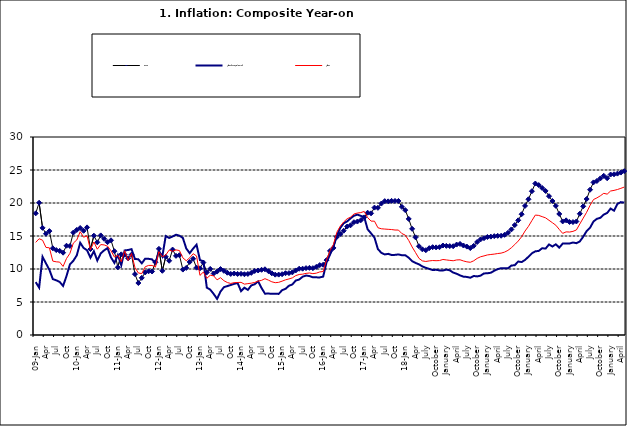
| Category | Food | All Items less Farm Produce | All Items |
|---|---|---|---|
| 09-Jan | 18.436 | 8.013 | 14.034 |
| Feb | 20.041 | 7.178 | 14.584 |
| Mar | 16.233 | 11.842 | 14.366 |
| Apr | 15.342 | 10.85 | 13.268 |
| May | 15.74 | 9.88 | 13.212 |
| June | 13.138 | 8.472 | 11.194 |
| Jul | 12.867 | 8.285 | 11.09 |
| Aug | 12.746 | 8.044 | 11.046 |
| Sep | 12.472 | 7.431 | 10.39 |
| Oct | 13.524 | 8.933 | 11.588 |
| Nov | 13.482 | 10.702 | 12.368 |
| Dec | 15.518 | 11.249 | 13.93 |
| 10-Jan | 15.918 | 12.063 | 14.398 |
| Feb | 16.208 | 13.978 | 15.649 |
| Mar | 15.79 | 13.184 | 14.812 |
| Apr | 16.306 | 12.844 | 15.044 |
| May | 13.023 | 11.711 | 12.915 |
| Jun | 15.053 | 12.686 | 14.099 |
| Jul | 14.043 | 11.287 | 13.002 |
| Aug | 15.09 | 12.366 | 13.702 |
| Sep | 14.57 | 12.83 | 13.65 |
| Oct | 14.065 | 13.168 | 13.45 |
| Nov | 14.351 | 11.746 | 12.766 |
| Dec | 12.701 | 10.917 | 11.815 |
| 11-Jan | 10.255 | 12.118 | 12.08 |
| Feb | 12.221 | 10.569 | 11.1 |
| Mar | 12.169 | 12.815 | 12.779 |
| Apr | 11.629 | 12.882 | 11.291 |
| May | 12.179 | 13.006 | 12.352 |
| Jun | 9.22 | 11.524 | 10.23 |
| Jul | 7.877 | 11.472 | 9.397 |
| Aug | 8.665 | 10.863 | 9.301 |
| Sep | 9.479 | 11.567 | 10.339 |
| Oct | 9.656 | 11.539 | 10.544 |
| Nov | 9.623 | 11.459 | 10.54 |
| Dec | 11.02 | 10.822 | 10.283 |
| 12-Jan | 13.053 | 12.748 | 12.626 |
| 12-Feb | 9.729 | 11.901 | 11.866 |
| 12-Mar | 11.848 | 14.995 | 12.111 |
| Apr | 11.246 | 14.703 | 12.866 |
| May | 12.942 | 14.926 | 12.688 |
| Jun | 11.991 | 15.199 | 12.892 |
| Jul | 12.093 | 15.045 | 12.797 |
| Aug | 9.91 | 14.714 | 11.689 |
| Sep | 10.164 | 13.101 | 11.253 |
| Oct | 11.064 | 12.398 | 11.693 |
| Nov | 11.553 | 13.092 | 12.32 |
| Dec | 10.199 | 13.685 | 11.981 |
| 13-Jan | 10.106 | 11.342 | 9.031 |
| Feb | 10.973 | 11.184 | 9.542 |
| Mar | 9.482 | 7.179 | 8.593 |
| Apr | 10.006 | 6.874 | 9.052 |
| May | 9.321 | 6.227 | 8.964 |
| Jun | 9.606 | 5.472 | 8.353 |
| Jul | 9.994 | 6.58 | 8.682 |
| Aug | 9.723 | 7.245 | 8.231 |
| Sep | 9.437 | 7.41 | 7.952 |
| Oct | 9.249 | 7.579 | 7.807 |
| Nov | 9.313 | 7.75 | 7.931 |
| Dec | 9.253 | 7.872 | 7.957 |
| 14-Jan | 9.271 | 6.648 | 7.977 |
| Feb | 9.207 | 7.166 | 7.707 |
| Mar | 9.254 | 6.836 | 7.783 |
| Apr | 9.414 | 7.508 | 7.851 |
| May | 9.698 | 7.693 | 7.965 |
| Jun | 9.776 | 8.122 | 8.167 |
| Jul | 9.878 | 7.116 | 8.281 |
| Aug | 9.959 | 6.264 | 8.534 |
| Sep | 9.676 | 6.278 | 8.317 |
| Oct | 9.343 | 6.252 | 8.06 |
| Nov | 9.144 | 6.255 | 7.927 |
| Dec | 9.152 | 6.225 | 7.978 |
| 15-Jan | 9.215 | 6.787 | 8.157 |
| Feb | 9.359 | 6.994 | 8.359 |
| Mar | 9.376 | 7.46 | 8.494 |
| Apr | 9.49 | 7.661 | 8.655 |
| May | 9.782 | 8.253 | 9.003 |
| Jun | 10.041 | 8.403 | 9.168 |
| Jul | 10.049 | 8.83 | 9.218 |
| Aug | 10.131 | 9.01 | 9.336 |
| Sep | 10.174 | 8.928 | 9.394 |
| Oct | 10.129 | 8.742 | 9.296 |
| Nov | 10.321 | 8.732 | 9.368 |
| Dec | 10.588 | 8.727 | 9.554 |
| 16-Jan | 10.642 | 8.841 | 9.617 |
| Feb | 11.348 | 11.041 | 11.379 |
| Mar | 12.745 | 12.17 | 12.775 |
| Apr | 13.194 | 13.352 | 13.721 |
| May | 14.861 | 15.054 | 15.577 |
| Jun | 15.302 | 16.224 | 16.48 |
| Jul | 15.799 | 16.929 | 17.127 |
| Aug | 16.427 | 17.208 | 17.609 |
| Sep | 16.622 | 17.666 | 17.852 |
| Oct | 17.09 | 18.067 | 18.33 |
| Nov | 17.191 | 18.241 | 18.476 |
| Dec | 17.388 | 18.052 | 18.547 |
| 17-Jan | 17.818 | 17.867 | 18.719 |
| Feb | 18.528 | 16.011 | 17.78 |
| Mar | 18.436 | 15.404 | 17.256 |
| Apr | 19.303 | 14.75 | 17.244 |
| May | 19.266 | 13.016 | 16.251 |
| Jun | 19.915 | 12.455 | 16.098 |
| Jul | 20.284 | 12.207 | 16.053 |
| Aug | 20.251 | 12.296 | 16.012 |
| Sep | 20.321 | 12.123 | 15.979 |
| Oct | 20.306 | 12.142 | 15.905 |
| Nov | 20.308 | 12.206 | 15.901 |
| Dec | 19.415 | 12.089 | 15.372 |
| 18-Jan | 18.919 | 12.09 | 15.127 |
| Feb | 17.588 | 11.707 | 14.33 |
| Mar | 16.08 | 11.181 | 13.337 |
| Apr | 14.799 | 10.92 | 12.482 |
| May | 13.448 | 10.71 | 11.608 |
| June | 12.977 | 10.387 | 11.231 |
| July | 12.85 | 10.183 | 11.142 |
| August | 13.158 | 10.015 | 11.227 |
| September | 13.309 | 9.838 | 11.284 |
| October | 13.277 | 9.882 | 11.259 |
| November | 13.301 | 9.787 | 11.281 |
| December | 13.559 | 9.771 | 11.442 |
| January | 13.505 | 9.91 | 11.374 |
| February | 13.473 | 9.8 | 11.306 |
| March | 13.451 | 9.461 | 11.251 |
| April | 13.701 | 9.28 | 11.372 |
| May | 13.794 | 9.033 | 11.396 |
| June | 13.558 | 8.841 | 11.217 |
| July | 13.392 | 8.798 | 11.084 |
| August | 13.17 | 8.678 | 11.016 |
| September | 13.507 | 8.945 | 11.244 |
| October | 14.088 | 8.876 | 11.607 |
| November | 14.482 | 8.993 | 11.854 |
| December | 14.667 | 9.331 | 11.982 |
| January | 14.849 | 9.349 | 12.132 |
| February | 14.904 | 9.434 | 12.199 |
| March | 14.977 | 9.732 | 12.257 |
| April | 15.026 | 9.979 | 12.341 |
| May | 15.036 | 10.12 | 12.404 |
| June | 15.175 | 10.128 | 12.559 |
| July | 15.482 | 10.102 | 12.821 |
| August | 15.996 | 10.521 | 13.22 |
| September | 16.66 | 10.581 | 13.707 |
| October | 17.378 | 11.137 | 14.233 |
| November | 18.298 | 11.05 | 14.887 |
| December | 19.562 | 11.374 | 15.753 |
| January | 20.567 | 11.854 | 16.466 |
| February | 21.786 | 12.382 | 17.335 |
| March | 22.948 | 12.673 | 18.171 |
| April | 22.719 | 12.743 | 18.117 |
| May | 22.277 | 13.145 | 17.933 |
| June | 21.829 | 13.094 | 17.751 |
| July | 21.032 | 13.72 | 17.377 |
| August | 20.303 | 13.408 | 17.009 |
| September | 19.566 | 13.745 | 16.63 |
| October | 18.338 | 13.24 | 15.994 |
| November | 17.209 | 13.851 | 15.396 |
| December | 17.37 | 13.873 | 15.625 |
| January | 17.126 | 13.869 | 15.601 |
| February | 17.11 | 14.011 | 15.702 |
| March | 17.203 | 13.914 | 15.915 |
| April | 18.371 | 14.178 | 16.819 |
| May | 19.496 | 14.897 | 17.712 |
| June | 20.603 | 15.747 | 18.596 |
| July | 22.017 | 16.258 | 19.643 |
| August | 23.121 | 17.2 | 20.525 |
| September | 23.336 | 17.601 | 20.774 |
| October | 23.723 | 17.759 | 21.087 |
| November | 24.125 | 18.244 | 21.466 |
| December | 23.754 | 18.492 | 21.344 |
| January | 24.316 | 19.156 | 21.816 |
| February | 24.352 | 18.84 | 21.91 |
| March | 24.451 | 19.856 | 22.043 |
| April | 24.611 | 20.135 | 22.222 |
| May | 24.825 | 20.057 | 22.413 |